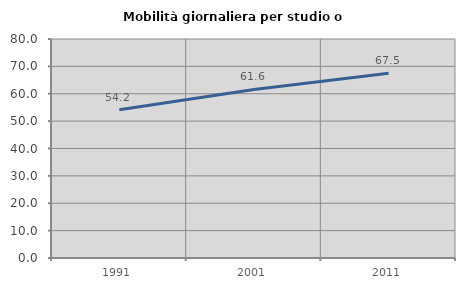
| Category | Mobilità giornaliera per studio o lavoro |
|---|---|
| 1991.0 | 54.169 |
| 2001.0 | 61.572 |
| 2011.0 | 67.491 |